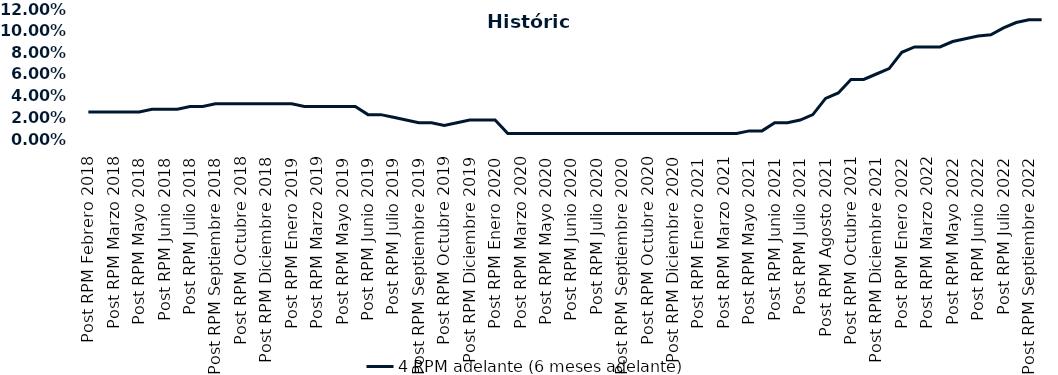
| Category | 4 RPM adelante (6 meses adelante) |
|---|---|
| Post RPM Febrero 2018 | 0.025 |
| Pre RPM Marzo 2018 | 0.025 |
| Post RPM Marzo 2018 | 0.025 |
| Pre RPM Mayo 2018 | 0.025 |
| Post RPM Mayo 2018 | 0.025 |
| Pre RPM Junio 2018 | 0.028 |
| Post RPM Junio 2018 | 0.028 |
| Pre RPM Julio 2018 | 0.028 |
| Post RPM Julio 2018 | 0.03 |
| Pre RPM Septiembre 2018 | 0.03 |
| Post RPM Septiembre 2018 | 0.032 |
| Pre RPM Octubre 2018 | 0.032 |
| Post RPM Octubre 2018 | 0.032 |
| Pre RPM Diciembre 2018 | 0.032 |
| Post RPM Diciembre 2018 | 0.032 |
| Pre RPM Enero 2019 | 0.032 |
| Post RPM Enero 2019 | 0.032 |
| Pre RPM Marzo 2019 | 0.03 |
| Post RPM Marzo 2019 | 0.03 |
| Pre RPM Mayo 2019 | 0.03 |
| Post RPM Mayo 2019 | 0.03 |
| Pre RPM Junio 2019 | 0.03 |
| Post RPM Junio 2019 | 0.022 |
| Pre RPM Julio 2019 | 0.022 |
| Post RPM Julio 2019 | 0.02 |
| Pre RPM Septiembre 2019 | 0.018 |
| Post RPM Septiembre 2019 | 0.015 |
| Pre RPM Octubre 2019 | 0.015 |
| Post RPM Octubre 2019 | 0.012 |
| Pre RPM Diciembre 2019 | 0.015 |
| Post RPM Diciembre 2019 | 0.018 |
| Pre RPM Enero 2020 | 0.018 |
| Post RPM Enero 2020 | 0.018 |
| Pre RPM Marzo 2020 | 0.005 |
| Post RPM Marzo 2020 | 0.005 |
| Pre RPM Mayo 2020 | 0.005 |
| Post RPM Mayo 2020 | 0.005 |
| Pre RPM Junio 2020 | 0.005 |
| Post RPM Junio 2020 | 0.005 |
| Pre RPM Julio 2020 | 0.005 |
| Post RPM Julio 2020 | 0.005 |
| Pre RPM Septiembre 2020 | 0.005 |
| Post RPM Septiembre 2020 | 0.005 |
| Pre RPM Octubre 2020 | 0.005 |
| Post RPM Octubre 2020 | 0.005 |
| Pre RPM Diciembre 2020 | 0.005 |
| Post RPM Diciembre 2020 | 0.005 |
| Pre RPM Enero 2021 | 0.005 |
| Post RPM Enero 2021 | 0.005 |
| Pre RPM Marzo 2021 | 0.005 |
| Post RPM Marzo 2021 | 0.005 |
| Pre RPM Mayo 2021 | 0.005 |
| Post RPM Mayo 2021 | 0.008 |
| Pre RPM Junio 2021 | 0.008 |
| Post RPM Junio 2021 | 0.015 |
| Pre RPM Julio 2021 | 0.015 |
| Post RPM Julio 2021 | 0.018 |
| Pre RPM Agosto 2021 | 0.022 |
| Post RPM Agosto 2021 | 0.038 |
| Pre RPM Octubre 2021 | 0.042 |
| Post RPM Octubre 2021 | 0.055 |
| Pre RPM Diciembre 2021 | 0.055 |
| Post RPM Diciembre 2021 | 0.06 |
| Pre RPM Enero 2022 | 0.065 |
| Post RPM Enero 2022 | 0.08 |
| Pre RPM Marzo 2022 | 0.085 |
| Post RPM Marzo 2022 | 0.085 |
| Pre RPM Mayo 2022 | 0.085 |
| Post RPM Mayo 2022 | 0.09 |
| Pre RPM Junio 2022 | 0.092 |
| Post RPM Junio 2022 | 0.095 |
| Pre RPM Julio 2022 | 0.096 |
| Post RPM Julio 2022 | 0.102 |
| Pre RPM Septiembre 2022 | 0.108 |
| Post RPM Septiembre 2022 | 0.11 |
| Pre RPM Octubre 2022 | 0.11 |